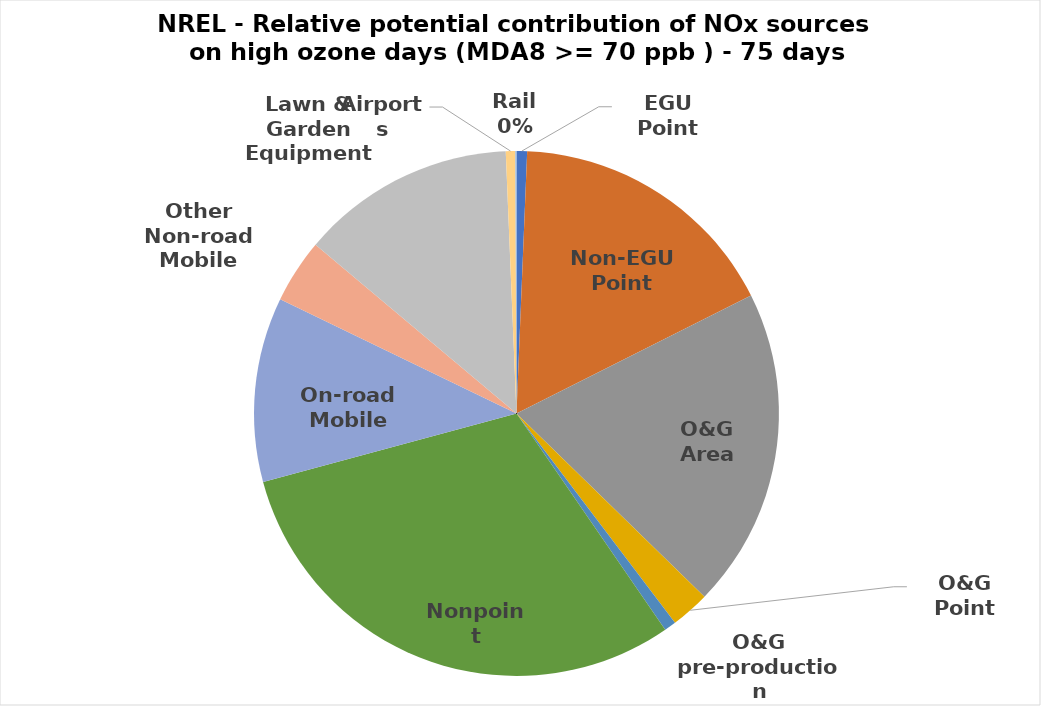
| Category | Total |
|---|---|
| EGU Point | 182.983 |
| Non-EGU Point | 4775.057 |
| O&G Area | 5557.874 |
| O&G Point | 672.644 |
| O&G pre-production | 205.781 |
| Nonpoint | 8567.29 |
| On-road Mobile | 3206.535 |
| Other Non-road Mobile | 1114.101 |
| Lawn & Garden Equipment | 3729.102 |
| Airports | 163.289 |
| Rail | 20.646 |